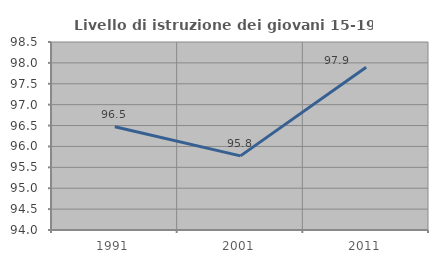
| Category | Livello di istruzione dei giovani 15-19 anni |
|---|---|
| 1991.0 | 96.471 |
| 2001.0 | 95.775 |
| 2011.0 | 97.895 |